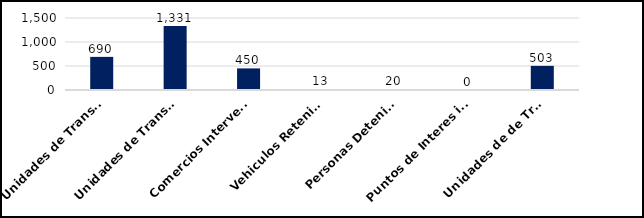
| Category | Series 0 |
|---|---|
| Unidades de Transporte de Combustibles Inspeccionados | 690 |
| Unidades de Transporte de Mercancias Inspeccionadas | 1331 |
| Comercios Intervenidos | 450 |
| Vehiculos Retenidos  | 13 |
| Personas Detenidas | 20 |
| Puntos de Interes intervenidos | 0 |
| Unidades de de Transporte Desechos Oleosos Inspeccionadas  | 503 |